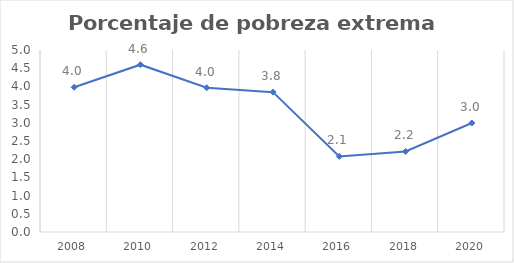
| Category | Series 0 |
|---|---|
| 2008.0 | 3.976 |
| 2010.0 | 4.597 |
| 2012.0 | 3.962 |
| 2014.0 | 3.842 |
| 2016.0 | 2.077 |
| 2018.0 | 2.212 |
| 2020.0 | 2.994 |